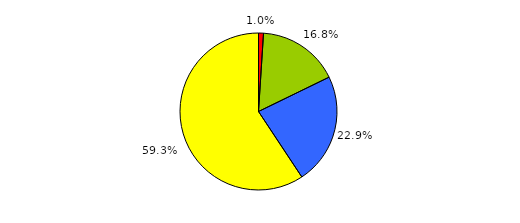
| Category | Series 0 |
|---|---|
| 0 | 5 |
| 1 | 82 |
| 2 | 112 |
| 3 | 290 |